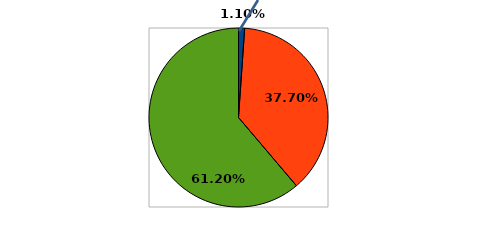
| Category | Series 0 |
|---|---|
| 0 | 0.011 |
| 1 | 0.377 |
| 2 | 0.612 |